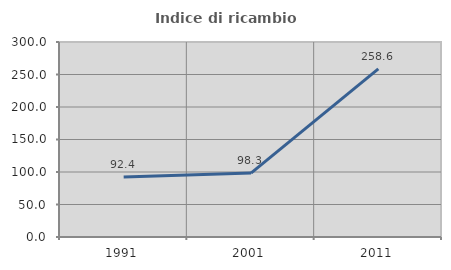
| Category | Indice di ricambio occupazionale  |
|---|---|
| 1991.0 | 92.437 |
| 2001.0 | 98.295 |
| 2011.0 | 258.559 |